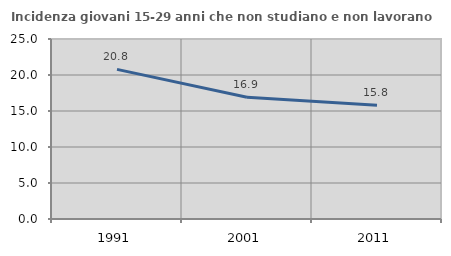
| Category | Incidenza giovani 15-29 anni che non studiano e non lavorano  |
|---|---|
| 1991.0 | 20.784 |
| 2001.0 | 16.908 |
| 2011.0 | 15.814 |